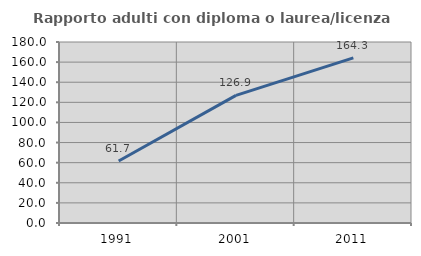
| Category | Rapporto adulti con diploma o laurea/licenza media  |
|---|---|
| 1991.0 | 61.655 |
| 2001.0 | 126.944 |
| 2011.0 | 164.271 |